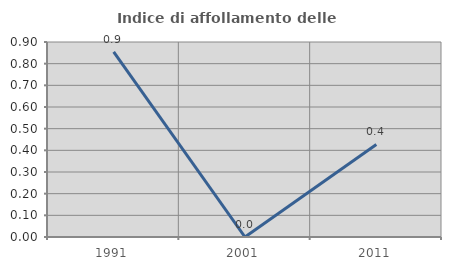
| Category | Indice di affollamento delle abitazioni  |
|---|---|
| 1991.0 | 0.855 |
| 2001.0 | 0 |
| 2011.0 | 0.427 |